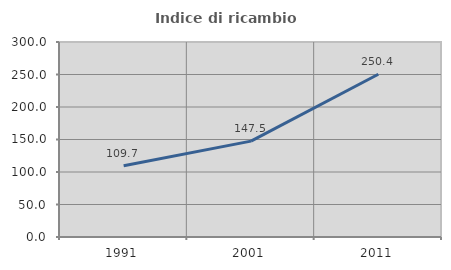
| Category | Indice di ricambio occupazionale  |
|---|---|
| 1991.0 | 109.659 |
| 2001.0 | 147.529 |
| 2011.0 | 250.359 |